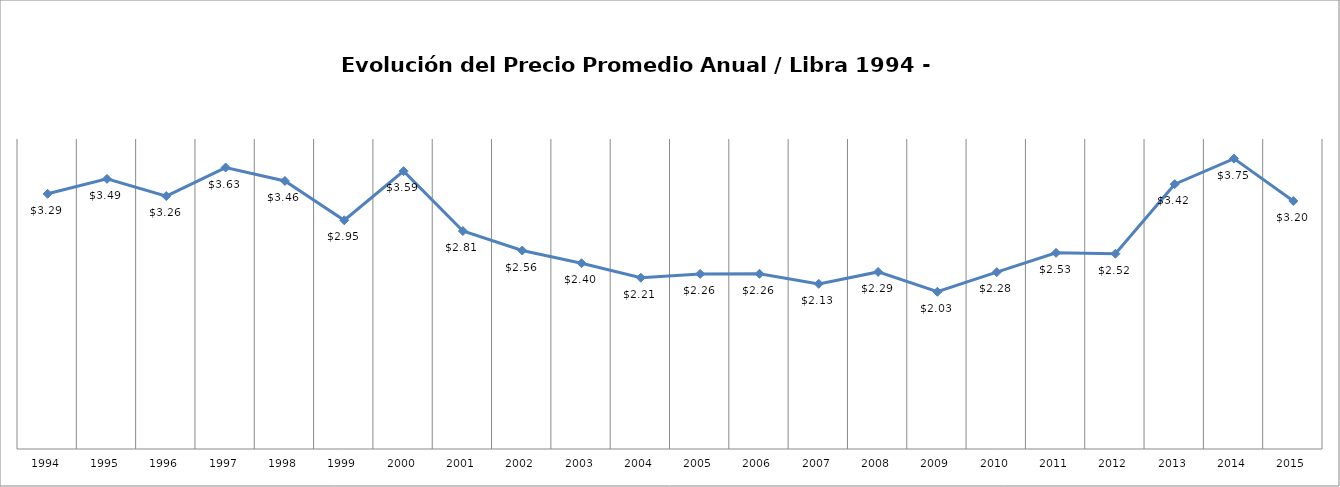
| Category | Series 0 |
|---|---|
| 1994.0 | 3.293 |
| 1995.0 | 3.485 |
| 1996.0 | 3.264 |
| 1997.0 | 3.632 |
| 1998.0 | 3.459 |
| 1999.0 | 2.951 |
| 2000.0 | 3.585 |
| 2001.0 | 2.813 |
| 2002.0 | 2.561 |
| 2003.0 | 2.397 |
| 2004.0 | 2.21 |
| 2005.0 | 2.259 |
| 2006.0 | 2.261 |
| 2007.0 | 2.131 |
| 2008.0 | 2.285 |
| 2009.0 | 2.029 |
| 2010.0 | 2.282 |
| 2011.0 | 2.531 |
| 2012.0 | 2.52 |
| 2013.0 | 3.417 |
| 2014.0 | 3.747 |
| 2015.0 | 3.2 |